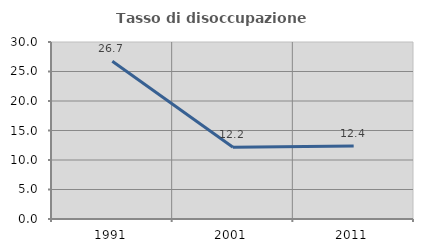
| Category | Tasso di disoccupazione giovanile  |
|---|---|
| 1991.0 | 26.733 |
| 2001.0 | 12.174 |
| 2011.0 | 12.371 |